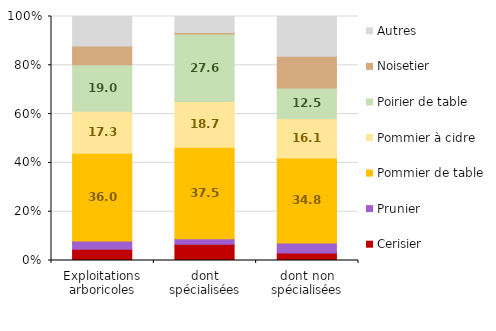
| Category | Cerisier | Prunier | Pommier de table | Pommier à cidre | Poirier de table | Noisetier | Autres |
|---|---|---|---|---|---|---|---|
| Exploitations arboricoles | 4.627 | 3.338 | 35.974 | 17.269 | 19.009 | 7.664 | 12.12 |
| dont spécialisées | 6.61 | 2.333 | 37.51 | 18.746 | 27.581 | 0.654 | 6.566 |
| dont non spécialisées | 3.12 | 4.102 | 34.806 | 16.146 | 12.495 | 12.99 | 16.34 |